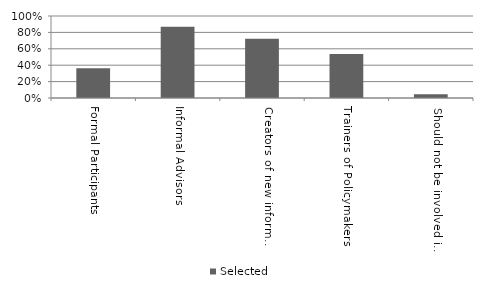
| Category | Selected |
|---|---|
| Formal Participants | 0.363 |
| Informal Advisors | 0.868 |
| Creators of new information/knowledge  | 0.722 |
| Trainers of Policymakers | 0.538 |
| Should not be involved in policy-making  | 0.047 |